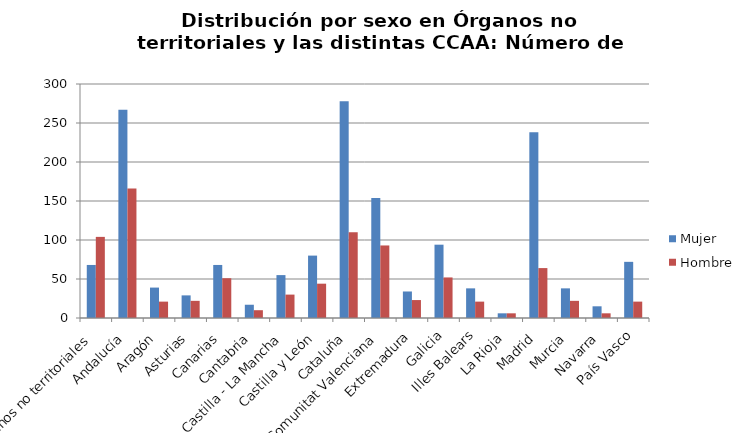
| Category | Mujer | Hombre |
|---|---|---|
| Órganos no territoriales | 68 | 104 |
| Andalucía | 267 | 166 |
| Aragón | 39 | 21 |
| Asturias | 29 | 22 |
| Canarias | 68 | 51 |
| Cantabria | 17 | 10 |
| Castilla - La Mancha | 55 | 30 |
| Castilla y León | 80 | 44 |
| Cataluña | 278 | 110 |
| Comunitat Valenciana | 154 | 93 |
| Extremadura | 34 | 23 |
| Galicia | 94 | 52 |
| Illes Balears | 38 | 21 |
| La Rioja | 6 | 6 |
| Madrid | 238 | 64 |
| Murcia | 38 | 22 |
| Navarra | 15 | 6 |
| País Vasco | 72 | 21 |